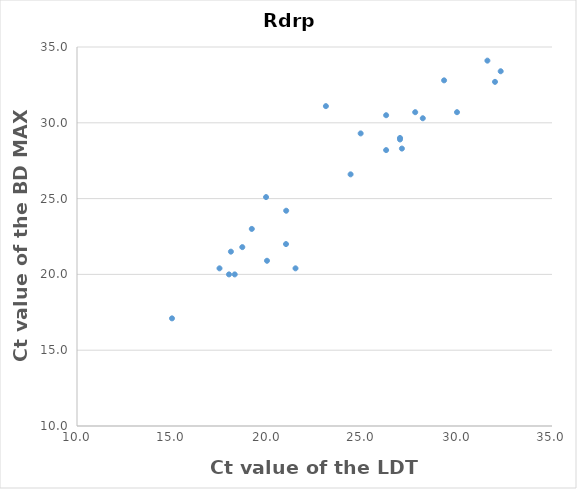
| Category | Series 0 |
|---|---|
| 28.5 | 35.3 |
| 23.1 | 31.1 |
| 19.95 | 25.1 |
| 19.2 | 23 |
| 31.6 | 34.1 |
| 21.01 | 24.2 |
| 24.93 | 29.3 |
| 26.27 | 28.2 |
| 26.27 | 30.5 |
| 29.32 | 32.8 |
| 18.3 | 20 |
| 28.2 | 30.3 |
| 18.1 | 21.5 |
| 30.0 | 30.7 |
| 27.8 | 30.7 |
| 20.0 | 20.9 |
| 17.5 | 20.4 |
| 18.0 | 20 |
| 27.0 | 29 |
| 21.5 | 20.4 |
| 18.7 | 21.8 |
| 32.0 | 32.7 |
| 24.4 | 26.6 |
| 27.1 | 28.3 |
| 32.3 | 33.4 |
| 21.0 | 22 |
| 27.0 | 28.9 |
| 15.0 | 17.1 |